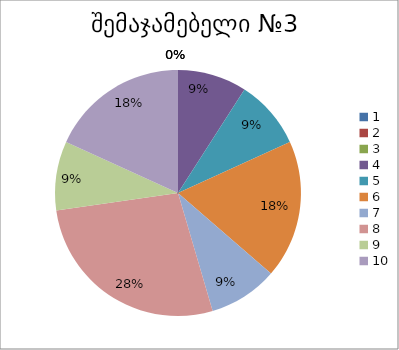
| Category | რაოდენობა | ქულა |
|---|---|---|
| 0 | 0 | 1 |
| 1 | 0 | 2 |
| 2 | 0 | 3 |
| 3 | 1 | 4 |
| 4 | 1 | 5 |
| 5 | 2 | 6 |
| 6 | 1 | 7 |
| 7 | 3 | 8 |
| 8 | 1 | 9 |
| 9 | 2 | 10 |